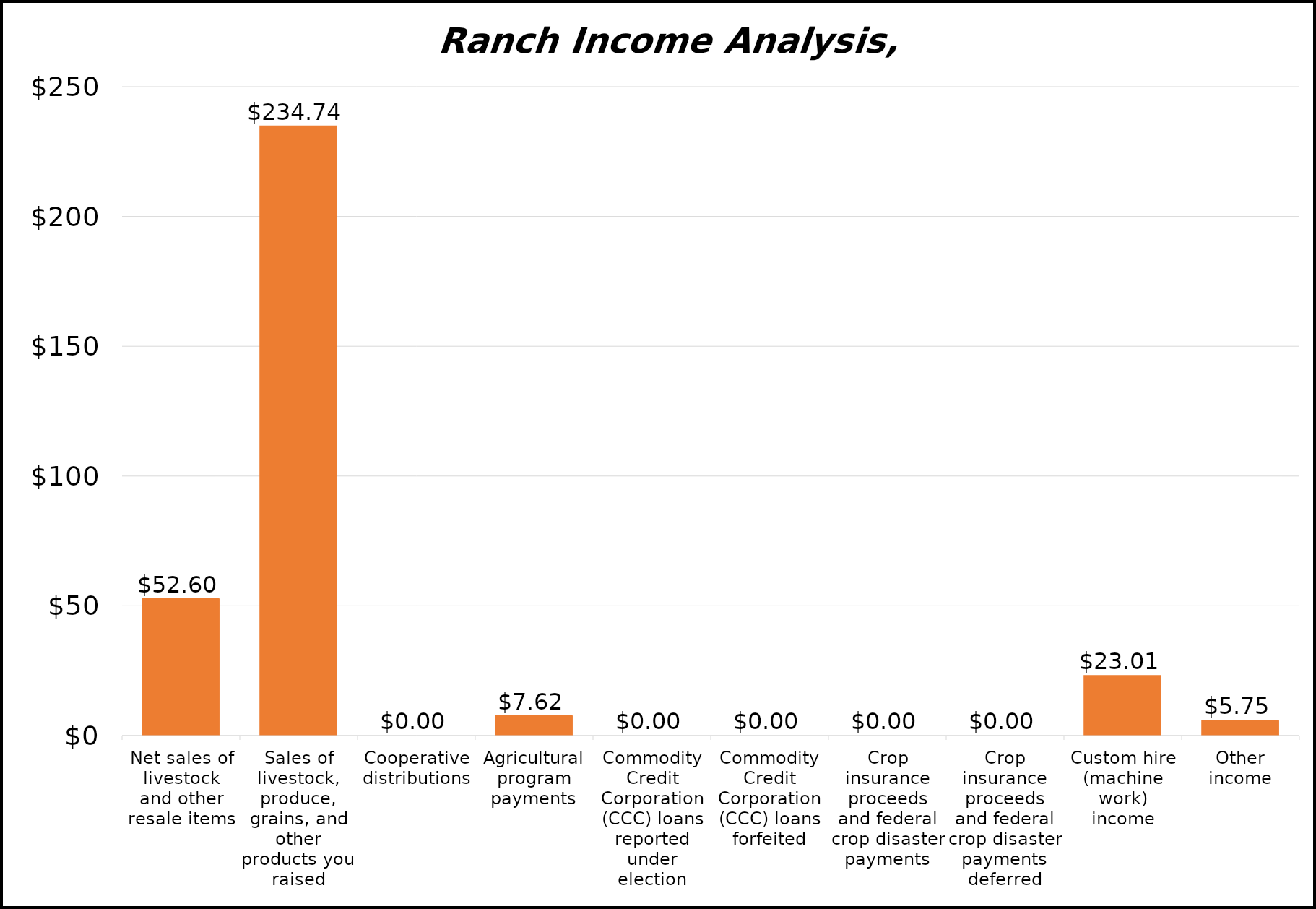
| Category | $/day |
|---|---|
| Net sales of livestock and other resale items | 52.603 |
| Sales of livestock, produce, grains, and other products you raised | 234.74 |
| Cooperative distributions | 0 |
| Agricultural program payments | 7.616 |
| Commodity Credit Corporation (CCC) loans reported under election | 0 |
| Commodity Credit Corporation (CCC) loans forfeited | 0 |
| Crop insurance proceeds and federal crop disaster payments | 0 |
| Crop insurance proceeds and federal crop disaster payments deferred | 0 |
| Custom hire (machine work) income | 23.014 |
| Other income | 5.753 |